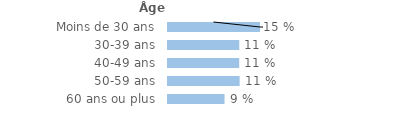
| Category | Series 0 |
|---|---|
| Moins de 30 ans | 0.146 |
| 30-39 ans | 0.113 |
| 40-49 ans | 0.113 |
| 50-59 ans | 0.114 |
| 60 ans ou plus | 0.09 |